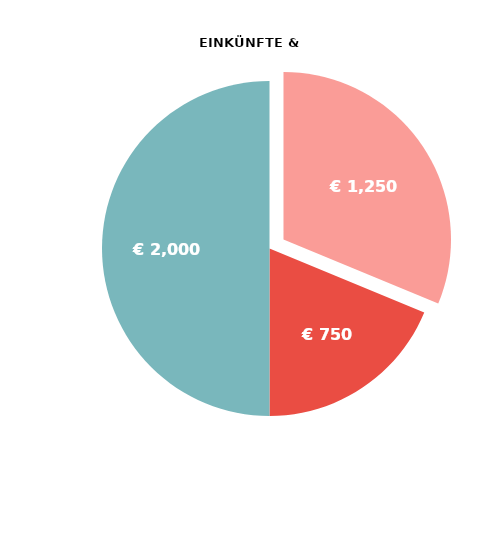
| Category | Series 0 |
|---|---|
| EINKÜNFTE MINUS AUSGABEN | 1250 |
| SUMME DER AUSGABEN | 750 |
| SUMME DER EINKÜNFTE | 2000 |